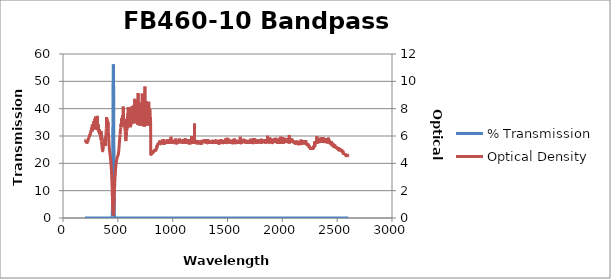
| Category | % Transmission |
|---|---|
| 2600.0 | 0.003 |
| 2599.0 | 0.003 |
| 2598.0 | 0.003 |
| 2597.0 | 0.003 |
| 2596.0 | 0.003 |
| 2595.0 | 0.003 |
| 2594.0 | 0.002 |
| 2593.0 | 0.003 |
| 2592.0 | 0.003 |
| 2591.0 | 0.003 |
| 2590.0 | 0.002 |
| 2589.0 | 0.003 |
| 2588.0 | 0.003 |
| 2587.0 | 0.003 |
| 2586.0 | 0.002 |
| 2585.0 | 0.003 |
| 2584.0 | 0.002 |
| 2583.0 | 0.002 |
| 2582.0 | 0.003 |
| 2581.0 | 0.003 |
| 2580.0 | 0.003 |
| 2579.0 | 0.003 |
| 2578.0 | 0.003 |
| 2577.0 | 0.002 |
| 2576.0 | 0.002 |
| 2575.0 | 0.002 |
| 2574.0 | 0.002 |
| 2573.0 | 0.002 |
| 2572.0 | 0.002 |
| 2571.0 | 0.002 |
| 2570.0 | 0.002 |
| 2569.0 | 0.002 |
| 2568.0 | 0.002 |
| 2567.0 | 0.002 |
| 2566.0 | 0.002 |
| 2565.0 | 0.002 |
| 2564.0 | 0.002 |
| 2563.0 | 0.002 |
| 2562.0 | 0.002 |
| 2561.0 | 0.002 |
| 2560.0 | 0.002 |
| 2559.0 | 0.002 |
| 2558.0 | 0.002 |
| 2557.0 | 0.002 |
| 2556.0 | 0.002 |
| 2555.0 | 0.002 |
| 2554.0 | 0.002 |
| 2553.0 | 0.001 |
| 2552.0 | 0.001 |
| 2551.0 | 0.002 |
| 2550.0 | 0.001 |
| 2549.0 | 0.002 |
| 2548.0 | 0.001 |
| 2547.0 | 0.001 |
| 2546.0 | 0.001 |
| 2545.0 | 0.001 |
| 2544.0 | 0.001 |
| 2543.0 | 0.001 |
| 2542.0 | 0.001 |
| 2541.0 | 0.001 |
| 2540.0 | 0.001 |
| 2539.0 | 0.001 |
| 2538.0 | 0.001 |
| 2537.0 | 0.001 |
| 2536.0 | 0.001 |
| 2535.0 | 0.001 |
| 2534.0 | 0.001 |
| 2533.0 | 0.001 |
| 2532.0 | 0.001 |
| 2531.0 | 0.001 |
| 2530.0 | 0.001 |
| 2529.0 | 0.001 |
| 2528.0 | 0.001 |
| 2527.0 | 0.001 |
| 2526.0 | 0.001 |
| 2525.0 | 0.001 |
| 2524.0 | 0.001 |
| 2523.0 | 0.001 |
| 2522.0 | 0.001 |
| 2521.0 | 0.001 |
| 2520.0 | 0.001 |
| 2519.0 | 0.001 |
| 2518.0 | 0.001 |
| 2517.0 | 0.001 |
| 2516.0 | 0.001 |
| 2515.0 | 0.001 |
| 2514.0 | 0.001 |
| 2513.0 | 0.001 |
| 2512.0 | 0.001 |
| 2511.0 | 0.001 |
| 2510.0 | 0.001 |
| 2509.0 | 0.001 |
| 2508.0 | 0.001 |
| 2507.0 | 0.001 |
| 2506.0 | 0.001 |
| 2505.0 | 0.001 |
| 2504.0 | 0.001 |
| 2503.0 | 0.001 |
| 2502.0 | 0.001 |
| 2501.0 | 0.001 |
| 2500.0 | 0.001 |
| 2499.0 | 0.001 |
| 2498.0 | 0.001 |
| 2497.0 | 0.001 |
| 2496.0 | 0.001 |
| 2495.0 | 0.001 |
| 2494.0 | 0.001 |
| 2493.0 | 0.001 |
| 2492.0 | 0.001 |
| 2491.0 | 0.001 |
| 2490.0 | 0.001 |
| 2489.0 | 0.001 |
| 2488.0 | 0.001 |
| 2487.0 | 0.001 |
| 2486.0 | 0.001 |
| 2485.0 | 0.001 |
| 2484.0 | 0.001 |
| 2483.0 | 0.001 |
| 2482.0 | 0.001 |
| 2481.0 | 0.001 |
| 2480.0 | 0 |
| 2479.0 | 0 |
| 2478.0 | 0.001 |
| 2477.0 | 0.001 |
| 2476.0 | 0.001 |
| 2475.0 | 0.001 |
| 2474.0 | 0 |
| 2473.0 | 0 |
| 2472.0 | 0.001 |
| 2471.0 | 0.001 |
| 2470.0 | 0.001 |
| 2469.0 | 0 |
| 2468.0 | 0 |
| 2467.0 | 0 |
| 2466.0 | 0 |
| 2465.0 | 0 |
| 2464.0 | 0 |
| 2463.0 | 0 |
| 2462.0 | 0 |
| 2461.0 | 0 |
| 2460.0 | 0 |
| 2459.0 | 0 |
| 2458.0 | 0 |
| 2457.0 | 0 |
| 2456.0 | 0 |
| 2455.0 | 0 |
| 2454.0 | 0.001 |
| 2453.0 | 0 |
| 2452.0 | 0 |
| 2451.0 | 0 |
| 2450.0 | 0 |
| 2449.0 | 0 |
| 2448.0 | 0 |
| 2447.0 | 0 |
| 2446.0 | 0 |
| 2445.0 | 0 |
| 2444.0 | 0 |
| 2443.0 | 0 |
| 2442.0 | 0 |
| 2441.0 | 0 |
| 2440.0 | 0 |
| 2439.0 | 0 |
| 2438.0 | 0 |
| 2437.0 | 0 |
| 2436.0 | 0 |
| 2435.0 | 0 |
| 2434.0 | 0 |
| 2433.0 | 0 |
| 2432.0 | 0 |
| 2431.0 | 0 |
| 2430.0 | 0 |
| 2429.0 | 0 |
| 2428.0 | 0 |
| 2427.0 | 0 |
| 2426.0 | 0 |
| 2425.0 | 0 |
| 2424.0 | 0 |
| 2423.0 | 0 |
| 2422.0 | 0 |
| 2421.0 | 0 |
| 2420.0 | 0 |
| 2419.0 | 0 |
| 2418.0 | 0 |
| 2417.0 | 0 |
| 2416.0 | 0 |
| 2415.0 | 0 |
| 2414.0 | 0 |
| 2413.0 | 0 |
| 2412.0 | 0 |
| 2411.0 | 0 |
| 2410.0 | 0 |
| 2409.0 | 0 |
| 2408.0 | 0 |
| 2407.0 | 0 |
| 2406.0 | 0 |
| 2405.0 | 0 |
| 2404.0 | 0 |
| 2403.0 | 0 |
| 2402.0 | 0 |
| 2401.0 | 0 |
| 2400.0 | 0 |
| 2399.0 | 0 |
| 2398.0 | 0 |
| 2397.0 | 0 |
| 2396.0 | 0 |
| 2395.0 | 0 |
| 2394.0 | 0 |
| 2393.0 | 0 |
| 2392.0 | 0 |
| 2391.0 | 0 |
| 2390.0 | 0 |
| 2389.0 | 0 |
| 2388.0 | 0 |
| 2387.0 | 0 |
| 2386.0 | 0 |
| 2385.0 | 0 |
| 2384.0 | 0 |
| 2383.0 | 0 |
| 2382.0 | 0 |
| 2381.0 | 0 |
| 2380.0 | 0 |
| 2379.0 | 0 |
| 2378.0 | 0 |
| 2377.0 | 0 |
| 2376.0 | 0 |
| 2375.0 | 0 |
| 2374.0 | 0 |
| 2373.0 | 0 |
| 2372.0 | 0 |
| 2371.0 | 0 |
| 2370.0 | 0 |
| 2369.0 | 0 |
| 2368.0 | 0 |
| 2367.0 | 0 |
| 2366.0 | 0 |
| 2365.0 | 0 |
| 2364.0 | 0 |
| 2363.0 | 0 |
| 2362.0 | 0 |
| 2361.0 | 0 |
| 2360.0 | 0 |
| 2359.0 | 0 |
| 2358.0 | 0 |
| 2357.0 | 0 |
| 2356.0 | 0 |
| 2355.0 | 0 |
| 2354.0 | 0 |
| 2353.0 | 0 |
| 2352.0 | 0 |
| 2351.0 | 0 |
| 2350.0 | 0 |
| 2349.0 | 0 |
| 2348.0 | 0 |
| 2347.0 | 0 |
| 2346.0 | 0 |
| 2345.0 | 0 |
| 2344.0 | 0 |
| 2343.0 | 0 |
| 2342.0 | 0 |
| 2341.0 | 0 |
| 2340.0 | 0 |
| 2339.0 | 0 |
| 2338.0 | 0 |
| 2337.0 | 0 |
| 2336.0 | 0 |
| 2335.0 | 0 |
| 2334.0 | 0 |
| 2333.0 | 0 |
| 2332.0 | 0 |
| 2331.0 | 0 |
| 2330.0 | 0 |
| 2329.0 | 0 |
| 2328.0 | 0 |
| 2327.0 | 0 |
| 2326.0 | 0 |
| 2325.0 | 0 |
| 2324.0 | 0 |
| 2323.0 | 0 |
| 2322.0 | 0 |
| 2321.0 | 0 |
| 2320.0 | 0 |
| 2319.0 | 0 |
| 2318.0 | 0 |
| 2317.0 | 0 |
| 2316.0 | 0 |
| 2315.0 | 0 |
| 2314.0 | 0 |
| 2313.0 | 0 |
| 2312.0 | 0 |
| 2311.0 | 0 |
| 2310.0 | 0 |
| 2309.0 | 0 |
| 2308.0 | 0 |
| 2307.0 | 0 |
| 2306.0 | 0 |
| 2305.0 | 0 |
| 2304.0 | 0 |
| 2303.0 | 0 |
| 2302.0 | 0 |
| 2301.0 | 0 |
| 2300.0 | 0 |
| 2299.0 | 0 |
| 2298.0 | 0 |
| 2297.0 | 0 |
| 2296.0 | 0 |
| 2295.0 | 0.001 |
| 2294.0 | 0 |
| 2293.0 | 0 |
| 2292.0 | 0.001 |
| 2291.0 | 0.001 |
| 2290.0 | 0.001 |
| 2289.0 | 0.001 |
| 2288.0 | 0.001 |
| 2287.0 | 0.001 |
| 2286.0 | 0.001 |
| 2285.0 | 0.001 |
| 2284.0 | 0.001 |
| 2283.0 | 0.001 |
| 2282.0 | 0.001 |
| 2281.0 | 0.001 |
| 2280.0 | 0.001 |
| 2279.0 | 0.001 |
| 2278.0 | 0.001 |
| 2277.0 | 0.001 |
| 2276.0 | 0.001 |
| 2275.0 | 0.001 |
| 2274.0 | 0.001 |
| 2273.0 | 0.001 |
| 2272.0 | 0.001 |
| 2271.0 | 0.001 |
| 2270.0 | 0.001 |
| 2269.0 | 0.001 |
| 2268.0 | 0.001 |
| 2267.0 | 0.001 |
| 2266.0 | 0.001 |
| 2265.0 | 0.001 |
| 2264.0 | 0.001 |
| 2263.0 | 0.001 |
| 2262.0 | 0.001 |
| 2261.0 | 0.001 |
| 2260.0 | 0.001 |
| 2259.0 | 0.001 |
| 2258.0 | 0.001 |
| 2257.0 | 0.001 |
| 2256.0 | 0.001 |
| 2255.0 | 0.001 |
| 2254.0 | 0.001 |
| 2253.0 | 0.001 |
| 2252.0 | 0.001 |
| 2251.0 | 0.001 |
| 2250.0 | 0.001 |
| 2249.0 | 0.001 |
| 2248.0 | 0.001 |
| 2247.0 | 0.001 |
| 2246.0 | 0.001 |
| 2245.0 | 0.001 |
| 2244.0 | 0.001 |
| 2243.0 | 0.001 |
| 2242.0 | 0.001 |
| 2241.0 | 0.001 |
| 2240.0 | 0 |
| 2239.0 | 0 |
| 2238.0 | 0 |
| 2237.0 | 0 |
| 2236.0 | 0 |
| 2235.0 | 0 |
| 2234.0 | 0 |
| 2233.0 | 0.001 |
| 2232.0 | 0 |
| 2231.0 | 0 |
| 2230.0 | 0 |
| 2229.0 | 0 |
| 2228.0 | 0 |
| 2227.0 | 0 |
| 2226.0 | 0 |
| 2225.0 | 0 |
| 2224.0 | 0 |
| 2223.0 | 0 |
| 2222.0 | 0 |
| 2221.0 | 0 |
| 2220.0 | 0 |
| 2219.0 | 0 |
| 2218.0 | 0 |
| 2217.0 | 0 |
| 2216.0 | 0 |
| 2215.0 | 0 |
| 2214.0 | 0 |
| 2213.0 | 0 |
| 2212.0 | 0 |
| 2211.0 | 0 |
| 2210.0 | 0 |
| 2209.0 | 0 |
| 2208.0 | 0 |
| 2207.0 | 0 |
| 2206.0 | 0 |
| 2205.0 | 0 |
| 2204.0 | 0 |
| 2203.0 | 0 |
| 2202.0 | 0 |
| 2201.0 | 0 |
| 2200.0 | 0 |
| 2199.0 | 0 |
| 2198.0 | 0 |
| 2197.0 | 0 |
| 2196.0 | 0 |
| 2195.0 | 0 |
| 2194.0 | 0 |
| 2193.0 | 0 |
| 2192.0 | 0 |
| 2191.0 | 0 |
| 2190.0 | 0 |
| 2189.0 | 0 |
| 2188.0 | 0 |
| 2187.0 | 0 |
| 2186.0 | 0 |
| 2185.0 | 0 |
| 2184.0 | 0 |
| 2183.0 | 0 |
| 2182.0 | 0 |
| 2181.0 | 0 |
| 2180.0 | 0 |
| 2179.0 | 0 |
| 2178.0 | 0 |
| 2177.0 | 0 |
| 2176.0 | 0 |
| 2175.0 | 0 |
| 2174.0 | 0 |
| 2173.0 | 0 |
| 2172.0 | 0 |
| 2171.0 | 0 |
| 2170.0 | 0 |
| 2169.0 | 0 |
| 2168.0 | 0 |
| 2167.0 | 0 |
| 2166.0 | 0 |
| 2165.0 | 0 |
| 2164.0 | 0 |
| 2163.0 | 0 |
| 2162.0 | 0 |
| 2161.0 | 0 |
| 2160.0 | 0 |
| 2159.0 | 0 |
| 2158.0 | 0 |
| 2157.0 | 0 |
| 2156.0 | 0 |
| 2155.0 | 0 |
| 2154.0 | 0 |
| 2153.0 | 0 |
| 2152.0 | 0 |
| 2151.0 | 0 |
| 2150.0 | 0 |
| 2149.0 | 0 |
| 2148.0 | 0 |
| 2147.0 | 0 |
| 2146.0 | 0 |
| 2145.0 | 0 |
| 2144.0 | 0 |
| 2143.0 | 0 |
| 2142.0 | 0 |
| 2141.0 | 0 |
| 2140.0 | 0 |
| 2139.0 | 0 |
| 2138.0 | 0 |
| 2137.0 | 0 |
| 2136.0 | 0 |
| 2135.0 | 0 |
| 2134.0 | 0 |
| 2133.0 | 0 |
| 2132.0 | 0 |
| 2131.0 | 0 |
| 2130.0 | 0 |
| 2129.0 | 0 |
| 2128.0 | 0 |
| 2127.0 | 0 |
| 2126.0 | 0 |
| 2125.0 | 0 |
| 2124.0 | 0 |
| 2123.0 | 0 |
| 2122.0 | 0 |
| 2121.0 | 0 |
| 2120.0 | 0 |
| 2119.0 | 0 |
| 2118.0 | 0 |
| 2117.0 | 0 |
| 2116.0 | 0 |
| 2115.0 | 0 |
| 2114.0 | 0 |
| 2113.0 | 0 |
| 2112.0 | 0 |
| 2111.0 | 0 |
| 2110.0 | 0 |
| 2109.0 | 0 |
| 2108.0 | 0 |
| 2107.0 | 0 |
| 2106.0 | 0 |
| 2105.0 | 0 |
| 2104.0 | 0 |
| 2103.0 | 0 |
| 2102.0 | 0 |
| 2101.0 | 0 |
| 2100.0 | 0 |
| 2099.0 | 0 |
| 2098.0 | 0 |
| 2097.0 | 0 |
| 2096.0 | 0 |
| 2095.0 | 0 |
| 2094.0 | 0 |
| 2093.0 | 0 |
| 2092.0 | 0 |
| 2091.0 | 0 |
| 2090.0 | 0 |
| 2089.0 | 0 |
| 2088.0 | 0 |
| 2087.0 | 0 |
| 2086.0 | 0 |
| 2085.0 | 0 |
| 2084.0 | 0 |
| 2083.0 | 0 |
| 2082.0 | 0 |
| 2081.0 | 0 |
| 2080.0 | 0 |
| 2079.0 | 0 |
| 2078.0 | 0 |
| 2077.0 | 0 |
| 2076.0 | 0 |
| 2075.0 | 0 |
| 2074.0 | 0 |
| 2073.0 | 0 |
| 2072.0 | 0 |
| 2071.0 | 0 |
| 2070.0 | 0 |
| 2069.0 | 0 |
| 2068.0 | 0 |
| 2067.0 | 0 |
| 2066.0 | 0 |
| 2065.0 | 0 |
| 2064.0 | 0 |
| 2063.0 | 0 |
| 2062.0 | 0 |
| 2061.0 | 0 |
| 2060.0 | 0 |
| 2059.0 | 0 |
| 2058.0 | 0 |
| 2057.0 | 0 |
| 2056.0 | 0 |
| 2055.0 | 0 |
| 2054.0 | 0 |
| 2053.0 | 0 |
| 2052.0 | 0 |
| 2051.0 | 0 |
| 2050.0 | 0 |
| 2049.0 | 0 |
| 2048.0 | 0 |
| 2047.0 | 0 |
| 2046.0 | 0 |
| 2045.0 | 0 |
| 2044.0 | 0 |
| 2043.0 | 0 |
| 2042.0 | 0 |
| 2041.0 | 0 |
| 2040.0 | 0 |
| 2039.0 | 0 |
| 2038.0 | 0 |
| 2037.0 | 0 |
| 2036.0 | 0 |
| 2035.0 | 0 |
| 2034.0 | 0 |
| 2033.0 | 0 |
| 2032.0 | 0 |
| 2031.0 | 0 |
| 2030.0 | 0 |
| 2029.0 | 0 |
| 2028.0 | 0 |
| 2027.0 | 0 |
| 2026.0 | 0 |
| 2025.0 | 0 |
| 2024.0 | 0 |
| 2023.0 | 0 |
| 2022.0 | 0 |
| 2021.0 | 0 |
| 2020.0 | 0 |
| 2019.0 | 0 |
| 2018.0 | 0 |
| 2017.0 | 0 |
| 2016.0 | 0 |
| 2015.0 | 0 |
| 2014.0 | 0 |
| 2013.0 | 0 |
| 2012.0 | 0 |
| 2011.0 | 0 |
| 2010.0 | 0 |
| 2009.0 | 0 |
| 2008.0 | 0 |
| 2007.0 | 0 |
| 2006.0 | 0 |
| 2005.0 | 0 |
| 2004.0 | 0 |
| 2003.0 | 0 |
| 2002.0 | 0 |
| 2001.0 | 0 |
| 2000.0 | 0 |
| 1999.0 | 0 |
| 1998.0 | 0 |
| 1997.0 | 0 |
| 1996.0 | 0 |
| 1995.0 | 0 |
| 1994.0 | 0 |
| 1993.0 | 0 |
| 1992.0 | 0 |
| 1991.0 | 0 |
| 1990.0 | 0 |
| 1989.0 | 0 |
| 1988.0 | 0 |
| 1987.0 | 0 |
| 1986.0 | 0 |
| 1985.0 | 0 |
| 1984.0 | 0 |
| 1983.0 | 0 |
| 1982.0 | 0 |
| 1981.0 | 0 |
| 1980.0 | 0 |
| 1979.0 | 0 |
| 1978.0 | 0 |
| 1977.0 | 0 |
| 1976.0 | 0 |
| 1975.0 | 0 |
| 1974.0 | 0 |
| 1973.0 | 0 |
| 1972.0 | 0 |
| 1971.0 | 0 |
| 1970.0 | 0 |
| 1969.0 | 0 |
| 1968.0 | 0 |
| 1967.0 | 0 |
| 1966.0 | 0 |
| 1965.0 | 0 |
| 1964.0 | 0 |
| 1963.0 | 0 |
| 1962.0 | 0 |
| 1961.0 | 0 |
| 1960.0 | 0 |
| 1959.0 | 0 |
| 1958.0 | 0 |
| 1957.0 | 0 |
| 1956.0 | 0 |
| 1955.0 | 0 |
| 1954.0 | 0 |
| 1953.0 | 0 |
| 1952.0 | 0 |
| 1951.0 | 0 |
| 1950.0 | 0 |
| 1949.0 | 0 |
| 1948.0 | 0 |
| 1947.0 | 0 |
| 1946.0 | 0 |
| 1945.0 | 0 |
| 1944.0 | 0 |
| 1943.0 | 0 |
| 1942.0 | 0 |
| 1941.0 | 0 |
| 1940.0 | 0 |
| 1939.0 | 0 |
| 1938.0 | 0 |
| 1937.0 | 0 |
| 1936.0 | 0 |
| 1935.0 | 0 |
| 1934.0 | 0 |
| 1933.0 | 0 |
| 1932.0 | 0 |
| 1931.0 | 0 |
| 1930.0 | 0 |
| 1929.0 | 0 |
| 1928.0 | 0 |
| 1927.0 | 0 |
| 1926.0 | 0 |
| 1925.0 | 0 |
| 1924.0 | 0 |
| 1923.0 | 0 |
| 1922.0 | 0 |
| 1921.0 | 0 |
| 1920.0 | 0 |
| 1919.0 | 0 |
| 1918.0 | 0 |
| 1917.0 | 0 |
| 1916.0 | 0 |
| 1915.0 | 0 |
| 1914.0 | 0 |
| 1913.0 | 0 |
| 1912.0 | 0 |
| 1911.0 | 0 |
| 1910.0 | 0 |
| 1909.0 | 0 |
| 1908.0 | 0 |
| 1907.0 | 0 |
| 1906.0 | 0 |
| 1905.0 | 0 |
| 1904.0 | 0 |
| 1903.0 | 0 |
| 1902.0 | 0 |
| 1901.0 | 0 |
| 1900.0 | 0 |
| 1899.0 | 0 |
| 1898.0 | 0 |
| 1897.0 | 0 |
| 1896.0 | 0 |
| 1895.0 | 0 |
| 1894.0 | 0 |
| 1893.0 | 0 |
| 1892.0 | 0 |
| 1891.0 | 0 |
| 1890.0 | 0 |
| 1889.0 | 0 |
| 1888.0 | 0 |
| 1887.0 | 0 |
| 1886.0 | 0 |
| 1885.0 | 0 |
| 1884.0 | 0 |
| 1883.0 | 0 |
| 1882.0 | 0 |
| 1881.0 | 0 |
| 1880.0 | 0 |
| 1879.0 | 0 |
| 1878.0 | 0 |
| 1877.0 | 0 |
| 1876.0 | 0 |
| 1875.0 | 0 |
| 1874.0 | 0 |
| 1873.0 | 0 |
| 1872.0 | 0 |
| 1871.0 | 0 |
| 1870.0 | 0 |
| 1869.0 | 0 |
| 1868.0 | 0 |
| 1867.0 | 0 |
| 1866.0 | 0 |
| 1865.0 | 0 |
| 1864.0 | 0 |
| 1863.0 | 0 |
| 1862.0 | 0 |
| 1861.0 | 0 |
| 1860.0 | 0 |
| 1859.0 | 0 |
| 1858.0 | 0 |
| 1857.0 | 0 |
| 1856.0 | 0 |
| 1855.0 | 0 |
| 1854.0 | 0 |
| 1853.0 | 0 |
| 1852.0 | 0 |
| 1851.0 | 0 |
| 1850.0 | 0 |
| 1849.0 | 0 |
| 1848.0 | 0 |
| 1847.0 | 0 |
| 1846.0 | 0 |
| 1845.0 | 0 |
| 1844.0 | 0 |
| 1843.0 | 0 |
| 1842.0 | 0 |
| 1841.0 | 0 |
| 1840.0 | 0 |
| 1839.0 | 0 |
| 1838.0 | 0 |
| 1837.0 | 0 |
| 1836.0 | 0 |
| 1835.0 | 0 |
| 1834.0 | 0 |
| 1833.0 | 0 |
| 1832.0 | 0 |
| 1831.0 | 0 |
| 1830.0 | 0 |
| 1829.0 | 0 |
| 1828.0 | 0 |
| 1827.0 | 0 |
| 1826.0 | 0 |
| 1825.0 | 0 |
| 1824.0 | 0 |
| 1823.0 | 0 |
| 1822.0 | 0 |
| 1821.0 | 0 |
| 1820.0 | 0 |
| 1819.0 | 0 |
| 1818.0 | 0 |
| 1817.0 | 0 |
| 1816.0 | 0 |
| 1815.0 | 0 |
| 1814.0 | 0 |
| 1813.0 | 0 |
| 1812.0 | 0 |
| 1811.0 | 0 |
| 1810.0 | 0 |
| 1809.0 | 0 |
| 1808.0 | 0 |
| 1807.0 | 0 |
| 1806.0 | 0 |
| 1805.0 | 0 |
| 1804.0 | 0 |
| 1803.0 | 0 |
| 1802.0 | 0 |
| 1801.0 | 0 |
| 1800.0 | 0 |
| 1799.0 | 0 |
| 1798.0 | 0 |
| 1797.0 | 0 |
| 1796.0 | 0 |
| 1795.0 | 0 |
| 1794.0 | 0 |
| 1793.0 | 0 |
| 1792.0 | 0 |
| 1791.0 | 0 |
| 1790.0 | 0 |
| 1789.0 | 0 |
| 1788.0 | 0 |
| 1787.0 | 0 |
| 1786.0 | 0 |
| 1785.0 | 0 |
| 1784.0 | 0 |
| 1783.0 | 0 |
| 1782.0 | 0 |
| 1781.0 | 0 |
| 1780.0 | 0 |
| 1779.0 | 0 |
| 1778.0 | 0 |
| 1777.0 | 0 |
| 1776.0 | 0 |
| 1775.0 | 0 |
| 1774.0 | 0 |
| 1773.0 | 0 |
| 1772.0 | 0 |
| 1771.0 | 0 |
| 1770.0 | 0 |
| 1769.0 | 0 |
| 1768.0 | 0 |
| 1767.0 | 0 |
| 1766.0 | 0 |
| 1765.0 | 0 |
| 1764.0 | 0 |
| 1763.0 | 0 |
| 1762.0 | 0 |
| 1761.0 | 0 |
| 1760.0 | 0 |
| 1759.0 | 0 |
| 1758.0 | 0 |
| 1757.0 | 0 |
| 1756.0 | 0 |
| 1755.0 | 0 |
| 1754.0 | 0 |
| 1753.0 | 0 |
| 1752.0 | 0 |
| 1751.0 | 0 |
| 1750.0 | 0 |
| 1749.0 | 0 |
| 1748.0 | 0 |
| 1747.0 | 0 |
| 1746.0 | 0 |
| 1745.0 | 0 |
| 1744.0 | 0 |
| 1743.0 | 0 |
| 1742.0 | 0 |
| 1741.0 | 0 |
| 1740.0 | 0 |
| 1739.0 | 0 |
| 1738.0 | 0 |
| 1737.0 | 0 |
| 1736.0 | 0 |
| 1735.0 | 0 |
| 1734.0 | 0 |
| 1733.0 | 0 |
| 1732.0 | 0 |
| 1731.0 | 0 |
| 1730.0 | 0 |
| 1729.0 | 0 |
| 1728.0 | 0 |
| 1727.0 | 0 |
| 1726.0 | 0 |
| 1725.0 | 0 |
| 1724.0 | 0 |
| 1723.0 | 0 |
| 1722.0 | 0 |
| 1721.0 | 0 |
| 1720.0 | 0 |
| 1719.0 | 0 |
| 1718.0 | 0 |
| 1717.0 | 0 |
| 1716.0 | 0 |
| 1715.0 | 0 |
| 1714.0 | 0 |
| 1713.0 | 0 |
| 1712.0 | 0 |
| 1711.0 | 0 |
| 1710.0 | 0 |
| 1709.0 | 0 |
| 1708.0 | 0 |
| 1707.0 | 0 |
| 1706.0 | 0 |
| 1705.0 | 0 |
| 1704.0 | 0 |
| 1703.0 | 0 |
| 1702.0 | 0 |
| 1701.0 | 0 |
| 1700.0 | 0 |
| 1699.0 | 0 |
| 1698.0 | 0 |
| 1697.0 | 0 |
| 1696.0 | 0 |
| 1695.0 | 0 |
| 1694.0 | 0 |
| 1693.0 | 0 |
| 1692.0 | 0 |
| 1691.0 | 0 |
| 1690.0 | 0 |
| 1689.0 | 0 |
| 1688.0 | 0 |
| 1687.0 | 0 |
| 1686.0 | 0 |
| 1685.0 | 0 |
| 1684.0 | 0 |
| 1683.0 | 0 |
| 1682.0 | 0 |
| 1681.0 | 0 |
| 1680.0 | 0 |
| 1679.0 | 0 |
| 1678.0 | 0 |
| 1677.0 | 0 |
| 1676.0 | 0 |
| 1675.0 | 0 |
| 1674.0 | 0 |
| 1673.0 | 0 |
| 1672.0 | 0 |
| 1671.0 | 0 |
| 1670.0 | 0 |
| 1669.0 | 0 |
| 1668.0 | 0 |
| 1667.0 | 0 |
| 1666.0 | 0 |
| 1665.0 | 0 |
| 1664.0 | 0 |
| 1663.0 | 0 |
| 1662.0 | 0 |
| 1661.0 | 0 |
| 1660.0 | 0 |
| 1659.0 | 0 |
| 1658.0 | 0 |
| 1657.0 | 0 |
| 1656.0 | 0 |
| 1655.0 | 0 |
| 1654.0 | 0 |
| 1653.0 | 0 |
| 1652.0 | 0 |
| 1651.0 | 0 |
| 1650.0 | 0 |
| 1649.0 | 0 |
| 1648.0 | 0 |
| 1647.0 | 0 |
| 1646.0 | 0 |
| 1645.0 | 0 |
| 1644.0 | 0 |
| 1643.0 | 0 |
| 1642.0 | 0 |
| 1641.0 | 0 |
| 1640.0 | 0 |
| 1639.0 | 0 |
| 1638.0 | 0 |
| 1637.0 | 0 |
| 1636.0 | 0 |
| 1635.0 | 0 |
| 1634.0 | 0 |
| 1633.0 | 0 |
| 1632.0 | 0 |
| 1631.0 | 0 |
| 1630.0 | 0 |
| 1629.0 | 0 |
| 1628.0 | 0 |
| 1627.0 | 0 |
| 1626.0 | 0 |
| 1625.0 | 0 |
| 1624.0 | 0 |
| 1623.0 | 0 |
| 1622.0 | 0 |
| 1621.0 | 0 |
| 1620.0 | 0 |
| 1619.0 | 0 |
| 1618.0 | 0 |
| 1617.0 | 0 |
| 1616.0 | 0 |
| 1615.0 | 0 |
| 1614.0 | 0 |
| 1613.0 | 0 |
| 1612.0 | 0 |
| 1611.0 | 0 |
| 1610.0 | 0 |
| 1609.0 | 0 |
| 1608.0 | 0 |
| 1607.0 | 0 |
| 1606.0 | 0 |
| 1605.0 | 0 |
| 1604.0 | 0 |
| 1603.0 | 0 |
| 1602.0 | 0 |
| 1601.0 | 0 |
| 1600.0 | 0 |
| 1599.0 | 0 |
| 1598.0 | 0 |
| 1597.0 | 0 |
| 1596.0 | 0 |
| 1595.0 | 0 |
| 1594.0 | 0 |
| 1593.0 | 0 |
| 1592.0 | 0 |
| 1591.0 | 0 |
| 1590.0 | 0 |
| 1589.0 | 0 |
| 1588.0 | 0 |
| 1587.0 | 0 |
| 1586.0 | 0 |
| 1585.0 | 0 |
| 1584.0 | 0 |
| 1583.0 | 0 |
| 1582.0 | 0 |
| 1581.0 | 0 |
| 1580.0 | 0 |
| 1579.0 | 0 |
| 1578.0 | 0 |
| 1577.0 | 0 |
| 1576.0 | 0 |
| 1575.0 | 0 |
| 1574.0 | 0 |
| 1573.0 | 0 |
| 1572.0 | 0 |
| 1571.0 | 0 |
| 1570.0 | 0 |
| 1569.0 | 0 |
| 1568.0 | 0 |
| 1567.0 | 0 |
| 1566.0 | 0 |
| 1565.0 | 0 |
| 1564.0 | 0 |
| 1563.0 | 0 |
| 1562.0 | 0 |
| 1561.0 | 0 |
| 1560.0 | 0 |
| 1559.0 | 0 |
| 1558.0 | 0 |
| 1557.0 | 0 |
| 1556.0 | 0 |
| 1555.0 | 0 |
| 1554.0 | 0 |
| 1553.0 | 0 |
| 1552.0 | 0 |
| 1551.0 | 0 |
| 1550.0 | 0 |
| 1549.0 | 0 |
| 1548.0 | 0 |
| 1547.0 | 0 |
| 1546.0 | 0 |
| 1545.0 | 0 |
| 1544.0 | 0 |
| 1543.0 | 0 |
| 1542.0 | 0 |
| 1541.0 | 0 |
| 1540.0 | 0 |
| 1539.0 | 0 |
| 1538.0 | 0 |
| 1537.0 | 0 |
| 1536.0 | 0 |
| 1535.0 | 0 |
| 1534.0 | 0 |
| 1533.0 | 0 |
| 1532.0 | 0 |
| 1531.0 | 0 |
| 1530.0 | 0 |
| 1529.0 | 0 |
| 1528.0 | 0 |
| 1527.0 | 0 |
| 1526.0 | 0 |
| 1525.0 | 0 |
| 1524.0 | 0 |
| 1523.0 | 0 |
| 1522.0 | 0 |
| 1521.0 | 0 |
| 1520.0 | 0 |
| 1519.0 | 0 |
| 1518.0 | 0 |
| 1517.0 | 0 |
| 1516.0 | 0 |
| 1515.0 | 0 |
| 1514.0 | 0 |
| 1513.0 | 0 |
| 1512.0 | 0 |
| 1511.0 | 0 |
| 1510.0 | 0 |
| 1509.0 | 0 |
| 1508.0 | 0 |
| 1507.0 | 0 |
| 1506.0 | 0 |
| 1505.0 | 0 |
| 1504.0 | 0 |
| 1503.0 | 0 |
| 1502.0 | 0 |
| 1501.0 | 0 |
| 1500.0 | 0 |
| 1499.0 | 0 |
| 1498.0 | 0 |
| 1497.0 | 0 |
| 1496.0 | 0 |
| 1495.0 | 0 |
| 1494.0 | 0 |
| 1493.0 | 0 |
| 1492.0 | 0 |
| 1491.0 | 0 |
| 1490.0 | 0 |
| 1489.0 | 0 |
| 1488.0 | 0 |
| 1487.0 | 0 |
| 1486.0 | 0 |
| 1485.0 | 0 |
| 1484.0 | 0 |
| 1483.0 | 0 |
| 1482.0 | 0 |
| 1481.0 | 0 |
| 1480.0 | 0 |
| 1479.0 | 0 |
| 1478.0 | 0 |
| 1477.0 | 0 |
| 1476.0 | 0 |
| 1475.0 | 0 |
| 1474.0 | 0 |
| 1473.0 | 0 |
| 1472.0 | 0 |
| 1471.0 | 0 |
| 1470.0 | 0 |
| 1469.0 | 0 |
| 1468.0 | 0 |
| 1467.0 | 0 |
| 1466.0 | 0 |
| 1465.0 | 0 |
| 1464.0 | 0 |
| 1463.0 | 0 |
| 1462.0 | 0 |
| 1461.0 | 0 |
| 1460.0 | 0 |
| 1459.0 | 0 |
| 1458.0 | 0 |
| 1457.0 | 0 |
| 1456.0 | 0 |
| 1455.0 | 0 |
| 1454.0 | 0 |
| 1453.0 | 0 |
| 1452.0 | 0 |
| 1451.0 | 0 |
| 1450.0 | 0 |
| 1449.0 | 0 |
| 1448.0 | 0 |
| 1447.0 | 0 |
| 1446.0 | 0 |
| 1445.0 | 0 |
| 1444.0 | 0 |
| 1443.0 | 0 |
| 1442.0 | 0 |
| 1441.0 | 0 |
| 1440.0 | 0 |
| 1439.0 | 0 |
| 1438.0 | 0 |
| 1437.0 | 0 |
| 1436.0 | 0 |
| 1435.0 | 0 |
| 1434.0 | 0 |
| 1433.0 | 0 |
| 1432.0 | 0 |
| 1431.0 | 0 |
| 1430.0 | 0 |
| 1429.0 | 0 |
| 1428.0 | 0 |
| 1427.0 | 0 |
| 1426.0 | 0 |
| 1425.0 | 0 |
| 1424.0 | 0 |
| 1423.0 | 0 |
| 1422.0 | 0 |
| 1421.0 | 0 |
| 1420.0 | 0 |
| 1419.0 | 0 |
| 1418.0 | 0 |
| 1417.0 | 0 |
| 1416.0 | 0 |
| 1415.0 | 0 |
| 1414.0 | 0 |
| 1413.0 | 0 |
| 1412.0 | 0 |
| 1411.0 | 0 |
| 1410.0 | 0 |
| 1409.0 | 0 |
| 1408.0 | 0 |
| 1407.0 | 0 |
| 1406.0 | 0 |
| 1405.0 | 0 |
| 1404.0 | 0 |
| 1403.0 | 0 |
| 1402.0 | 0 |
| 1401.0 | 0 |
| 1400.0 | 0 |
| 1399.0 | 0 |
| 1398.0 | 0 |
| 1397.0 | 0 |
| 1396.0 | 0 |
| 1395.0 | 0 |
| 1394.0 | 0 |
| 1393.0 | 0 |
| 1392.0 | 0 |
| 1391.0 | 0 |
| 1390.0 | 0 |
| 1389.0 | 0 |
| 1388.0 | 0 |
| 1387.0 | 0 |
| 1386.0 | 0 |
| 1385.0 | 0 |
| 1384.0 | 0 |
| 1383.0 | 0 |
| 1382.0 | 0 |
| 1381.0 | 0 |
| 1380.0 | 0 |
| 1379.0 | 0 |
| 1378.0 | 0 |
| 1377.0 | 0 |
| 1376.0 | 0 |
| 1375.0 | 0 |
| 1374.0 | 0 |
| 1373.0 | 0 |
| 1372.0 | 0 |
| 1371.0 | 0 |
| 1370.0 | 0 |
| 1369.0 | 0 |
| 1368.0 | 0 |
| 1367.0 | 0 |
| 1366.0 | 0 |
| 1365.0 | 0 |
| 1364.0 | 0 |
| 1363.0 | 0 |
| 1362.0 | 0 |
| 1361.0 | 0 |
| 1360.0 | 0 |
| 1359.0 | 0 |
| 1358.0 | 0 |
| 1357.0 | 0 |
| 1356.0 | 0 |
| 1355.0 | 0 |
| 1354.0 | 0 |
| 1353.0 | 0 |
| 1352.0 | 0 |
| 1351.0 | 0 |
| 1350.0 | 0 |
| 1349.0 | 0 |
| 1348.0 | 0 |
| 1347.0 | 0 |
| 1346.0 | 0 |
| 1345.0 | 0 |
| 1344.0 | 0 |
| 1343.0 | 0 |
| 1342.0 | 0 |
| 1341.0 | 0 |
| 1340.0 | 0 |
| 1339.0 | 0 |
| 1338.0 | 0 |
| 1337.0 | 0 |
| 1336.0 | 0 |
| 1335.0 | 0 |
| 1334.0 | 0 |
| 1333.0 | 0 |
| 1332.0 | 0 |
| 1331.0 | 0 |
| 1330.0 | 0 |
| 1329.0 | 0 |
| 1328.0 | 0 |
| 1327.0 | 0 |
| 1326.0 | 0 |
| 1325.0 | 0 |
| 1324.0 | 0 |
| 1323.0 | 0 |
| 1322.0 | 0 |
| 1321.0 | 0 |
| 1320.0 | 0 |
| 1319.0 | 0 |
| 1318.0 | 0 |
| 1317.0 | 0 |
| 1316.0 | 0 |
| 1315.0 | 0 |
| 1314.0 | 0 |
| 1313.0 | 0 |
| 1312.0 | 0 |
| 1311.0 | 0 |
| 1310.0 | 0 |
| 1309.0 | 0 |
| 1308.0 | 0 |
| 1307.0 | 0 |
| 1306.0 | 0 |
| 1305.0 | 0 |
| 1304.0 | 0 |
| 1303.0 | 0 |
| 1302.0 | 0 |
| 1301.0 | 0 |
| 1300.0 | 0 |
| 1299.0 | 0 |
| 1298.0 | 0 |
| 1297.0 | 0 |
| 1296.0 | 0 |
| 1295.0 | 0 |
| 1294.0 | 0 |
| 1293.0 | 0 |
| 1292.0 | 0 |
| 1291.0 | 0 |
| 1290.0 | 0 |
| 1289.0 | 0 |
| 1288.0 | 0 |
| 1287.0 | 0 |
| 1286.0 | 0 |
| 1285.0 | 0 |
| 1284.0 | 0 |
| 1283.0 | 0 |
| 1282.0 | 0 |
| 1281.0 | 0 |
| 1280.0 | 0 |
| 1279.0 | 0 |
| 1278.0 | 0 |
| 1277.0 | 0 |
| 1276.0 | 0 |
| 1275.0 | 0 |
| 1274.0 | 0 |
| 1273.0 | 0 |
| 1272.0 | 0 |
| 1271.0 | 0 |
| 1270.0 | 0 |
| 1269.0 | 0 |
| 1268.0 | 0 |
| 1267.0 | 0 |
| 1266.0 | 0 |
| 1265.0 | 0 |
| 1264.0 | 0 |
| 1263.0 | 0 |
| 1262.0 | 0 |
| 1261.0 | 0 |
| 1260.0 | 0 |
| 1259.0 | 0 |
| 1258.0 | 0 |
| 1257.0 | 0 |
| 1256.0 | 0 |
| 1255.0 | 0 |
| 1254.0 | 0 |
| 1253.0 | 0 |
| 1252.0 | 0 |
| 1251.0 | 0 |
| 1250.0 | 0 |
| 1249.0 | 0 |
| 1248.0 | 0 |
| 1247.0 | 0 |
| 1246.0 | 0 |
| 1245.0 | 0 |
| 1244.0 | 0 |
| 1243.0 | 0 |
| 1242.0 | 0 |
| 1241.0 | 0 |
| 1240.0 | 0 |
| 1239.0 | 0 |
| 1238.0 | 0 |
| 1237.0 | 0 |
| 1236.0 | 0 |
| 1235.0 | 0 |
| 1234.0 | 0 |
| 1233.0 | 0 |
| 1232.0 | 0 |
| 1231.0 | 0 |
| 1230.0 | 0 |
| 1229.0 | 0 |
| 1228.0 | 0 |
| 1227.0 | 0 |
| 1226.0 | 0 |
| 1225.0 | 0 |
| 1224.0 | 0 |
| 1223.0 | 0 |
| 1222.0 | 0 |
| 1221.0 | 0 |
| 1220.0 | 0 |
| 1219.0 | 0 |
| 1218.0 | 0 |
| 1217.0 | 0 |
| 1216.0 | 0 |
| 1215.0 | 0 |
| 1214.0 | 0 |
| 1213.0 | 0 |
| 1212.0 | 0 |
| 1211.0 | 0 |
| 1210.0 | 0 |
| 1209.0 | 0 |
| 1208.0 | 0 |
| 1207.0 | 0 |
| 1206.0 | 0 |
| 1205.0 | 0 |
| 1204.0 | 0 |
| 1203.0 | 0 |
| 1202.0 | 0 |
| 1201.0 | 0 |
| 1200.0 | 0 |
| 1199.0 | 0 |
| 1198.0 | 0 |
| 1197.0 | 0 |
| 1196.0 | 0 |
| 1195.0 | 0 |
| 1194.0 | 0 |
| 1193.0 | 0 |
| 1192.0 | 0 |
| 1191.0 | 0 |
| 1190.0 | 0 |
| 1189.0 | 0 |
| 1188.0 | 0 |
| 1187.0 | 0 |
| 1186.0 | 0 |
| 1185.0 | 0 |
| 1184.0 | 0 |
| 1183.0 | 0 |
| 1182.0 | 0 |
| 1181.0 | 0 |
| 1180.0 | 0 |
| 1179.0 | 0 |
| 1178.0 | 0 |
| 1177.0 | 0 |
| 1176.0 | 0 |
| 1175.0 | 0 |
| 1174.0 | 0 |
| 1173.0 | 0 |
| 1172.0 | 0 |
| 1171.0 | 0 |
| 1170.0 | 0 |
| 1169.0 | 0 |
| 1168.0 | 0 |
| 1167.0 | 0 |
| 1166.0 | 0 |
| 1165.0 | 0 |
| 1164.0 | 0 |
| 1163.0 | 0 |
| 1162.0 | 0 |
| 1161.0 | 0 |
| 1160.0 | 0 |
| 1159.0 | 0 |
| 1158.0 | 0 |
| 1157.0 | 0 |
| 1156.0 | 0 |
| 1155.0 | 0 |
| 1154.0 | 0 |
| 1153.0 | 0 |
| 1152.0 | 0 |
| 1151.0 | 0 |
| 1150.0 | 0 |
| 1149.0 | 0 |
| 1148.0 | 0 |
| 1147.0 | 0 |
| 1146.0 | 0 |
| 1145.0 | 0 |
| 1144.0 | 0 |
| 1143.0 | 0 |
| 1142.0 | 0 |
| 1141.0 | 0 |
| 1140.0 | 0 |
| 1139.0 | 0 |
| 1138.0 | 0 |
| 1137.0 | 0 |
| 1136.0 | 0 |
| 1135.0 | 0 |
| 1134.0 | 0 |
| 1133.0 | 0 |
| 1132.0 | 0 |
| 1131.0 | 0 |
| 1130.0 | 0 |
| 1129.0 | 0 |
| 1128.0 | 0 |
| 1127.0 | 0 |
| 1126.0 | 0 |
| 1125.0 | 0 |
| 1124.0 | 0 |
| 1123.0 | 0 |
| 1122.0 | 0 |
| 1121.0 | 0 |
| 1120.0 | 0 |
| 1119.0 | 0 |
| 1118.0 | 0 |
| 1117.0 | 0 |
| 1116.0 | 0 |
| 1115.0 | 0 |
| 1114.0 | 0 |
| 1113.0 | 0 |
| 1112.0 | 0 |
| 1111.0 | 0 |
| 1110.0 | 0 |
| 1109.0 | 0 |
| 1108.0 | 0 |
| 1107.0 | 0 |
| 1106.0 | 0 |
| 1105.0 | 0 |
| 1104.0 | 0 |
| 1103.0 | 0 |
| 1102.0 | 0 |
| 1101.0 | 0 |
| 1100.0 | 0 |
| 1099.0 | 0 |
| 1098.0 | 0 |
| 1097.0 | 0 |
| 1096.0 | 0 |
| 1095.0 | 0 |
| 1094.0 | 0 |
| 1093.0 | 0 |
| 1092.0 | 0 |
| 1091.0 | 0 |
| 1090.0 | 0 |
| 1089.0 | 0 |
| 1088.0 | 0 |
| 1087.0 | 0 |
| 1086.0 | 0 |
| 1085.0 | 0 |
| 1084.0 | 0 |
| 1083.0 | 0 |
| 1082.0 | 0 |
| 1081.0 | 0 |
| 1080.0 | 0 |
| 1079.0 | 0 |
| 1078.0 | 0 |
| 1077.0 | 0 |
| 1076.0 | 0 |
| 1075.0 | 0 |
| 1074.0 | 0 |
| 1073.0 | 0 |
| 1072.0 | 0 |
| 1071.0 | 0 |
| 1070.0 | 0 |
| 1069.0 | 0 |
| 1068.0 | 0 |
| 1067.0 | 0 |
| 1066.0 | 0 |
| 1065.0 | 0 |
| 1064.0 | 0 |
| 1063.0 | 0 |
| 1062.0 | 0 |
| 1061.0 | 0 |
| 1060.0 | 0 |
| 1059.0 | 0 |
| 1058.0 | 0 |
| 1057.0 | 0 |
| 1056.0 | 0 |
| 1055.0 | 0 |
| 1054.0 | 0 |
| 1053.0 | 0 |
| 1052.0 | 0 |
| 1051.0 | 0 |
| 1050.0 | 0 |
| 1049.0 | 0 |
| 1048.0 | 0 |
| 1047.0 | 0 |
| 1046.0 | 0 |
| 1045.0 | 0 |
| 1044.0 | 0 |
| 1043.0 | 0 |
| 1042.0 | 0 |
| 1041.0 | 0 |
| 1040.0 | 0 |
| 1039.0 | 0 |
| 1038.0 | 0 |
| 1037.0 | 0 |
| 1036.0 | 0 |
| 1035.0 | 0 |
| 1034.0 | 0 |
| 1033.0 | 0 |
| 1032.0 | 0 |
| 1031.0 | 0 |
| 1030.0 | 0 |
| 1029.0 | 0 |
| 1028.0 | 0 |
| 1027.0 | 0 |
| 1026.0 | 0 |
| 1025.0 | 0 |
| 1024.0 | 0 |
| 1023.0 | 0 |
| 1022.0 | 0 |
| 1021.0 | 0 |
| 1020.0 | 0 |
| 1019.0 | 0 |
| 1018.0 | 0 |
| 1017.0 | 0 |
| 1016.0 | 0 |
| 1015.0 | 0 |
| 1014.0 | 0 |
| 1013.0 | 0 |
| 1012.0 | 0 |
| 1011.0 | 0 |
| 1010.0 | 0 |
| 1009.0 | 0 |
| 1008.0 | 0 |
| 1007.0 | 0 |
| 1006.0 | 0 |
| 1005.0 | 0 |
| 1004.0 | 0 |
| 1003.0 | 0 |
| 1002.0 | 0 |
| 1001.0 | 0 |
| 1000.0 | 0 |
| 999.0 | 0 |
| 998.0 | 0 |
| 997.0 | 0 |
| 996.0 | 0 |
| 995.0 | 0 |
| 994.0 | 0 |
| 993.0 | 0 |
| 992.0 | 0 |
| 991.0 | 0 |
| 990.0 | 0 |
| 989.0 | 0 |
| 988.0 | 0 |
| 987.0 | 0 |
| 986.0 | 0 |
| 985.0 | 0 |
| 984.0 | 0 |
| 983.0 | 0 |
| 982.0 | 0 |
| 981.0 | 0 |
| 980.0 | 0 |
| 979.0 | 0 |
| 978.0 | 0 |
| 977.0 | 0 |
| 976.0 | 0 |
| 975.0 | 0 |
| 974.0 | 0 |
| 973.0 | 0 |
| 972.0 | 0 |
| 971.0 | 0 |
| 970.0 | 0 |
| 969.0 | 0 |
| 968.0 | 0 |
| 967.0 | 0 |
| 966.0 | 0 |
| 965.0 | 0 |
| 964.0 | 0 |
| 963.0 | 0 |
| 962.0 | 0 |
| 961.0 | 0 |
| 960.0 | 0 |
| 959.0 | 0 |
| 958.0 | 0 |
| 957.0 | 0 |
| 956.0 | 0 |
| 955.0 | 0 |
| 954.0 | 0 |
| 953.0 | 0 |
| 952.0 | 0 |
| 951.0 | 0 |
| 950.0 | 0 |
| 949.0 | 0 |
| 948.0 | 0 |
| 947.0 | 0 |
| 946.0 | 0 |
| 945.0 | 0 |
| 944.0 | 0 |
| 943.0 | 0 |
| 942.0 | 0 |
| 941.0 | 0 |
| 940.0 | 0 |
| 939.0 | 0 |
| 938.0 | 0 |
| 937.0 | 0 |
| 936.0 | 0 |
| 935.0 | 0 |
| 934.0 | 0 |
| 933.0 | 0 |
| 932.0 | 0 |
| 931.0 | 0 |
| 930.0 | 0 |
| 929.0 | 0 |
| 928.0 | 0 |
| 927.0 | 0 |
| 926.0 | 0 |
| 925.0 | 0 |
| 924.0 | 0 |
| 923.0 | 0 |
| 922.0 | 0 |
| 921.0 | 0 |
| 920.0 | 0 |
| 919.0 | 0 |
| 918.0 | 0 |
| 917.0 | 0 |
| 916.0 | 0 |
| 915.0 | 0 |
| 914.0 | 0 |
| 913.0 | 0 |
| 912.0 | 0 |
| 911.0 | 0 |
| 910.0 | 0 |
| 909.0 | 0 |
| 908.0 | 0 |
| 907.0 | 0 |
| 906.0 | 0 |
| 905.0 | 0 |
| 904.0 | 0 |
| 903.0 | 0 |
| 902.0 | 0 |
| 901.0 | 0 |
| 900.0 | 0 |
| 899.0 | 0 |
| 898.0 | 0 |
| 897.0 | 0 |
| 896.0 | 0 |
| 895.0 | 0 |
| 894.0 | 0 |
| 893.0 | 0 |
| 892.0 | 0 |
| 891.0 | 0 |
| 890.0 | 0 |
| 889.0 | 0 |
| 888.0 | 0 |
| 887.0 | 0 |
| 886.0 | 0 |
| 885.0 | 0 |
| 884.0 | 0 |
| 883.0 | 0 |
| 882.0 | 0 |
| 881.0 | 0 |
| 880.0 | 0 |
| 879.0 | 0 |
| 878.0 | 0 |
| 877.0 | 0 |
| 876.0 | 0 |
| 875.0 | 0 |
| 874.0 | 0 |
| 873.0 | 0 |
| 872.0 | 0 |
| 871.0 | 0 |
| 870.0 | 0 |
| 869.0 | 0 |
| 868.0 | 0 |
| 867.0 | 0 |
| 866.0 | 0 |
| 865.0 | 0 |
| 864.0 | 0 |
| 863.0 | 0 |
| 862.0 | 0.001 |
| 861.0 | 0.001 |
| 860.0 | 0.001 |
| 859.0 | 0.001 |
| 858.0 | 0.001 |
| 857.0 | 0.001 |
| 856.0 | 0 |
| 855.0 | 0.001 |
| 854.0 | 0.001 |
| 853.0 | 0.001 |
| 852.0 | 0.001 |
| 851.0 | 0.001 |
| 850.0 | 0.001 |
| 849.0 | 0.001 |
| 848.0 | 0.001 |
| 847.0 | 0.001 |
| 846.0 | 0.001 |
| 845.0 | 0.001 |
| 844.0 | 0.001 |
| 843.0 | 0.001 |
| 842.0 | 0.001 |
| 841.0 | 0.001 |
| 840.0 | 0.001 |
| 839.0 | 0.001 |
| 838.0 | 0.001 |
| 837.0 | 0.001 |
| 836.0 | 0.001 |
| 835.0 | 0.001 |
| 834.0 | 0.001 |
| 833.0 | 0.001 |
| 832.0 | 0.001 |
| 831.0 | 0.001 |
| 830.0 | 0.001 |
| 829.0 | 0.001 |
| 828.0 | 0.001 |
| 827.0 | 0.001 |
| 826.0 | 0.001 |
| 825.0 | 0.001 |
| 824.0 | 0.001 |
| 823.0 | 0.002 |
| 822.0 | 0.001 |
| 821.0 | 0.001 |
| 820.0 | 0.001 |
| 819.0 | 0.001 |
| 818.0 | 0.002 |
| 817.0 | 0.002 |
| 816.0 | 0.002 |
| 815.0 | 0.002 |
| 814.0 | 0.001 |
| 813.0 | 0.001 |
| 812.0 | 0.002 |
| 811.0 | 0.001 |
| 810.0 | 0.002 |
| 809.0 | 0.002 |
| 808.0 | 0.002 |
| 807.0 | 0.002 |
| 806.0 | 0.002 |
| 805.0 | 0.002 |
| 804.0 | 0.002 |
| 803.0 | 0.002 |
| 802.0 | 0.002 |
| 801.0 | 0.002 |
| 800.0 | 0.002 |
| 799.0 | 0 |
| 798.0 | 0 |
| 797.0 | 0 |
| 796.0 | 0 |
| 795.0 | 0 |
| 794.0 | 0 |
| 793.0 | 0 |
| 792.0 | 0 |
| 791.0 | 0 |
| 790.0 | 0 |
| 789.0 | 0 |
| 788.0 | 0 |
| 787.0 | 0 |
| 786.0 | 0 |
| 785.0 | 0 |
| 784.0 | 0 |
| 783.0 | 0 |
| 782.0 | 0 |
| 781.0 | 0 |
| 780.0 | 0 |
| 779.0 | 0 |
| 778.0 | 0 |
| 777.0 | 0 |
| 776.0 | 0 |
| 775.0 | 0 |
| 774.0 | 0 |
| 773.0 | 0 |
| 772.0 | 0 |
| 771.0 | 0 |
| 770.0 | 0 |
| 769.0 | 0 |
| 768.0 | 0 |
| 767.0 | 0 |
| 766.0 | 0 |
| 765.0 | 0 |
| 764.0 | 0 |
| 763.0 | 0 |
| 762.0 | 0 |
| 761.0 | 0 |
| 760.0 | 0 |
| 759.0 | 0 |
| 758.0 | 0 |
| 757.0 | 0 |
| 756.0 | 0 |
| 755.0 | 0 |
| 754.0 | 0 |
| 753.0 | 0 |
| 752.0 | 0 |
| 751.0 | 0 |
| 750.0 | 0 |
| 749.0 | 0 |
| 748.0 | 0 |
| 747.0 | 0 |
| 746.0 | 0 |
| 745.0 | 0 |
| 744.0 | 0 |
| 743.0 | 0 |
| 742.0 | 0 |
| 741.0 | 0 |
| 740.0 | 0 |
| 739.0 | 0 |
| 738.0 | 0 |
| 737.0 | 0 |
| 736.0 | 0 |
| 735.0 | 0 |
| 734.0 | 0 |
| 733.0 | 0 |
| 732.0 | 0 |
| 731.0 | 0 |
| 730.0 | 0 |
| 729.0 | 0 |
| 728.0 | 0 |
| 727.0 | 0 |
| 726.0 | 0 |
| 725.0 | 0 |
| 724.0 | 0 |
| 723.0 | 0 |
| 722.0 | 0 |
| 721.0 | 0 |
| 720.0 | 0 |
| 719.0 | 0 |
| 718.0 | 0 |
| 717.0 | 0 |
| 716.0 | 0 |
| 715.0 | 0 |
| 714.0 | 0 |
| 713.0 | 0 |
| 712.0 | 0 |
| 711.0 | 0 |
| 710.0 | 0 |
| 709.0 | 0 |
| 708.0 | 0 |
| 707.0 | 0 |
| 706.0 | 0 |
| 705.0 | 0 |
| 704.0 | 0 |
| 703.0 | 0 |
| 702.0 | 0 |
| 701.0 | 0 |
| 700.0 | 0 |
| 699.0 | 0 |
| 698.0 | 0 |
| 697.0 | 0 |
| 696.0 | 0 |
| 695.0 | 0 |
| 694.0 | 0 |
| 693.0 | 0 |
| 692.0 | 0 |
| 691.0 | 0 |
| 690.0 | 0 |
| 689.0 | 0 |
| 688.0 | 0 |
| 687.0 | 0 |
| 686.0 | 0 |
| 685.0 | 0 |
| 684.0 | 0 |
| 683.0 | 0 |
| 682.0 | 0 |
| 681.0 | 0 |
| 680.0 | 0 |
| 679.0 | 0 |
| 678.0 | 0 |
| 677.0 | 0 |
| 676.0 | 0 |
| 675.0 | 0 |
| 674.0 | 0 |
| 673.0 | 0 |
| 672.0 | 0 |
| 671.0 | 0 |
| 670.0 | 0 |
| 669.0 | 0 |
| 668.0 | 0 |
| 667.0 | 0 |
| 666.0 | 0 |
| 665.0 | 0 |
| 664.0 | 0 |
| 663.0 | 0 |
| 662.0 | 0 |
| 661.0 | 0 |
| 660.0 | 0 |
| 659.0 | 0 |
| 658.0 | 0 |
| 657.0 | 0 |
| 656.0 | 0 |
| 655.0 | 0 |
| 654.0 | 0 |
| 653.0 | 0 |
| 652.0 | 0 |
| 651.0 | 0 |
| 650.0 | 0 |
| 649.0 | 0 |
| 648.0 | 0 |
| 647.0 | 0 |
| 646.0 | 0 |
| 645.0 | 0 |
| 644.0 | 0 |
| 643.0 | 0 |
| 642.0 | 0 |
| 641.0 | 0 |
| 640.0 | 0 |
| 639.0 | 0 |
| 638.0 | 0 |
| 637.0 | 0 |
| 636.0 | 0 |
| 635.0 | 0 |
| 634.0 | 0 |
| 633.0 | 0 |
| 632.0 | 0 |
| 631.0 | 0 |
| 630.0 | 0 |
| 629.0 | 0 |
| 628.0 | 0 |
| 627.0 | 0 |
| 626.0 | 0 |
| 625.0 | 0 |
| 624.0 | 0 |
| 623.0 | 0 |
| 622.0 | 0 |
| 621.0 | 0 |
| 620.0 | 0 |
| 619.0 | 0 |
| 618.0 | 0 |
| 617.0 | 0 |
| 616.0 | 0 |
| 615.0 | 0 |
| 614.0 | 0 |
| 613.0 | 0 |
| 612.0 | 0 |
| 611.0 | 0 |
| 610.0 | 0 |
| 609.0 | 0 |
| 608.0 | 0 |
| 607.0 | 0 |
| 606.0 | 0 |
| 605.0 | 0 |
| 604.0 | 0 |
| 603.0 | 0 |
| 602.0 | 0 |
| 601.0 | 0 |
| 600.0 | 0 |
| 599.0 | 0 |
| 598.0 | 0 |
| 597.0 | 0 |
| 596.0 | 0 |
| 595.0 | 0 |
| 594.0 | 0 |
| 593.0 | 0 |
| 592.0 | 0 |
| 591.0 | 0 |
| 590.0 | 0 |
| 589.0 | 0 |
| 588.0 | 0 |
| 587.0 | 0 |
| 586.0 | 0 |
| 585.0 | 0 |
| 584.0 | 0 |
| 583.0 | 0 |
| 582.0 | 0 |
| 581.0 | 0 |
| 580.0 | 0 |
| 579.0 | 0 |
| 578.0 | 0 |
| 577.0 | 0 |
| 576.0 | 0 |
| 575.0 | 0 |
| 574.0 | 0 |
| 573.0 | 0 |
| 572.0 | 0 |
| 571.0 | 0 |
| 570.0 | 0 |
| 569.0 | 0 |
| 568.0 | 0 |
| 567.0 | 0 |
| 566.0 | 0 |
| 565.0 | 0 |
| 564.0 | 0 |
| 563.0 | 0 |
| 562.0 | 0 |
| 561.0 | 0 |
| 560.0 | 0 |
| 559.0 | 0 |
| 558.0 | 0 |
| 557.0 | 0 |
| 556.0 | 0 |
| 555.0 | 0 |
| 554.0 | 0 |
| 553.0 | 0 |
| 552.0 | 0 |
| 551.0 | 0 |
| 550.0 | 0 |
| 549.0 | 0 |
| 548.0 | 0 |
| 547.0 | 0 |
| 546.0 | 0 |
| 545.0 | 0 |
| 544.0 | 0 |
| 543.0 | 0 |
| 542.0 | 0 |
| 541.0 | 0 |
| 540.0 | 0 |
| 539.0 | 0 |
| 538.0 | 0 |
| 537.0 | 0 |
| 536.0 | 0 |
| 535.0 | 0 |
| 534.0 | 0 |
| 533.0 | 0 |
| 532.0 | 0 |
| 531.0 | 0 |
| 530.0 | 0 |
| 529.0 | 0 |
| 528.0 | 0 |
| 527.0 | 0 |
| 526.0 | 0 |
| 525.0 | 0 |
| 524.0 | 0 |
| 523.0 | 0 |
| 522.0 | 0 |
| 521.0 | 0 |
| 520.0 | 0 |
| 519.0 | 0 |
| 518.0 | 0 |
| 517.0 | 0 |
| 516.0 | 0 |
| 515.0 | 0 |
| 514.0 | 0 |
| 513.0 | 0 |
| 512.0 | 0.001 |
| 511.0 | 0.001 |
| 510.0 | 0.001 |
| 509.0 | 0.001 |
| 508.0 | 0.001 |
| 507.0 | 0.002 |
| 506.0 | 0.002 |
| 505.0 | 0.002 |
| 504.0 | 0.002 |
| 503.0 | 0.002 |
| 502.0 | 0.003 |
| 501.0 | 0.003 |
| 500.0 | 0.003 |
| 499.0 | 0.003 |
| 498.0 | 0.003 |
| 497.0 | 0.003 |
| 496.0 | 0.003 |
| 495.0 | 0.004 |
| 494.0 | 0.004 |
| 493.0 | 0.004 |
| 492.0 | 0.004 |
| 491.0 | 0.005 |
| 490.0 | 0.005 |
| 489.0 | 0.006 |
| 488.0 | 0.006 |
| 487.0 | 0.007 |
| 486.0 | 0.008 |
| 485.0 | 0.009 |
| 484.0 | 0.011 |
| 483.0 | 0.013 |
| 482.0 | 0.016 |
| 481.0 | 0.019 |
| 480.0 | 0.023 |
| 479.0 | 0.029 |
| 478.0 | 0.038 |
| 477.0 | 0.05 |
| 476.0 | 0.067 |
| 475.0 | 0.092 |
| 474.0 | 0.131 |
| 473.0 | 0.192 |
| 472.0 | 0.29 |
| 471.0 | 0.457 |
| 470.0 | 0.755 |
| 469.0 | 1.299 |
| 468.0 | 2.364 |
| 467.0 | 4.503 |
| 466.0 | 8.108 |
| 465.0 | 15.726 |
| 464.0 | 25.478 |
| 463.0 | 36.352 |
| 462.0 | 45.929 |
| 461.0 | 52.651 |
| 460.0 | 56.081 |
| 459.0 | 56.273 |
| 458.0 | 53.713 |
| 457.0 | 49.106 |
| 456.0 | 42.94 |
| 455.0 | 34.648 |
| 454.0 | 24.699 |
| 453.0 | 15.217 |
| 452.0 | 8.243 |
| 451.0 | 4.155 |
| 450.0 | 2.07 |
| 449.0 | 1.07 |
| 448.0 | 0.586 |
| 447.0 | 0.337 |
| 446.0 | 0.203 |
| 445.0 | 0.128 |
| 444.0 | 0.084 |
| 443.0 | 0.057 |
| 442.0 | 0.04 |
| 441.0 | 0.029 |
| 440.0 | 0.021 |
| 439.0 | 0.016 |
| 438.0 | 0.012 |
| 437.0 | 0.01 |
| 436.0 | 0.008 |
| 435.0 | 0.006 |
| 434.0 | 0.005 |
| 433.0 | 0.004 |
| 432.0 | 0.004 |
| 431.0 | 0.003 |
| 430.0 | 0.003 |
| 429.0 | 0.002 |
| 428.0 | 0.002 |
| 427.0 | 0.002 |
| 426.0 | 0.001 |
| 425.0 | 0.001 |
| 424.0 | 0.001 |
| 423.0 | 0.001 |
| 422.0 | 0.001 |
| 421.0 | 0.001 |
| 420.0 | 0 |
| 419.0 | 0 |
| 418.0 | 0 |
| 417.0 | 0 |
| 416.0 | 0 |
| 415.0 | 0 |
| 414.0 | 0 |
| 413.0 | 0 |
| 412.0 | 0 |
| 411.0 | 0 |
| 410.0 | 0 |
| 409.0 | 0 |
| 408.0 | 0 |
| 407.0 | 0 |
| 406.0 | 0 |
| 405.0 | 0 |
| 404.0 | 0 |
| 403.0 | 0 |
| 402.0 | 0 |
| 401.0 | 0 |
| 400.0 | 0 |
| 399.0 | 0 |
| 398.0 | 0 |
| 397.0 | 0 |
| 396.0 | 0 |
| 395.0 | 0 |
| 394.0 | 0 |
| 393.0 | 0 |
| 392.0 | 0 |
| 391.0 | 0 |
| 390.0 | 0 |
| 389.0 | 0 |
| 388.0 | 0.001 |
| 387.0 | 0 |
| 386.0 | 0 |
| 385.0 | 0 |
| 384.0 | 0 |
| 383.0 | 0 |
| 382.0 | 0 |
| 381.0 | 0 |
| 380.0 | 0 |
| 379.0 | 0 |
| 378.0 | 0 |
| 377.0 | 0 |
| 376.0 | 0 |
| 375.0 | 0 |
| 374.0 | 0 |
| 373.0 | 0 |
| 372.0 | 0 |
| 371.0 | 0 |
| 370.0 | 0 |
| 369.0 | 0 |
| 368.0 | 0.001 |
| 367.0 | 0.001 |
| 366.0 | 0.001 |
| 365.0 | 0.001 |
| 364.0 | 0.001 |
| 363.0 | 0.001 |
| 362.0 | 0.001 |
| 361.0 | 0.001 |
| 360.0 | 0.001 |
| 359.0 | 0.001 |
| 358.0 | 0.001 |
| 357.0 | 0.001 |
| 356.0 | 0.001 |
| 355.0 | 0.001 |
| 354.0 | 0 |
| 353.0 | 0 |
| 352.0 | 0 |
| 351.0 | 0 |
| 350.0 | 0 |
| 349.0 | 0 |
| 348.0 | 0 |
| 347.0 | 0 |
| 346.0 | 0 |
| 345.0 | 0 |
| 344.0 | 0 |
| 343.0 | 0 |
| 342.0 | 0 |
| 341.0 | 0 |
| 340.0 | 0 |
| 339.0 | 0 |
| 338.0 | 0 |
| 337.0 | 0 |
| 336.0 | 0 |
| 335.0 | 0 |
| 334.0 | 0 |
| 333.0 | 0 |
| 332.0 | 0 |
| 331.0 | 0 |
| 330.0 | 0 |
| 329.0 | 0 |
| 328.0 | 0 |
| 327.0 | 0 |
| 326.0 | 0 |
| 325.0 | 0 |
| 324.0 | 0 |
| 323.0 | 0 |
| 322.0 | 0 |
| 321.0 | 0 |
| 320.0 | 0 |
| 319.0 | 0 |
| 318.0 | 0 |
| 317.0 | 0 |
| 316.0 | 0 |
| 315.0 | 0 |
| 314.0 | 0 |
| 313.0 | 0 |
| 312.0 | 0 |
| 311.0 | 0 |
| 310.0 | 0 |
| 309.0 | 0 |
| 308.0 | 0 |
| 307.0 | 0 |
| 306.0 | 0 |
| 305.0 | 0 |
| 304.0 | 0 |
| 303.0 | 0 |
| 302.0 | 0 |
| 301.0 | 0 |
| 300.0 | 0 |
| 299.0 | 0 |
| 298.0 | 0 |
| 297.0 | 0 |
| 296.0 | 0 |
| 295.0 | 0 |
| 294.0 | 0 |
| 293.0 | 0 |
| 292.0 | 0 |
| 291.0 | 0 |
| 290.0 | 0 |
| 289.0 | 0 |
| 288.0 | 0 |
| 287.0 | 0 |
| 286.0 | 0 |
| 285.0 | 0 |
| 284.0 | 0 |
| 283.0 | 0 |
| 282.0 | 0 |
| 281.0 | 0 |
| 280.0 | 0 |
| 279.0 | 0 |
| 278.0 | 0 |
| 277.0 | 0 |
| 276.0 | 0 |
| 275.0 | 0 |
| 274.0 | 0 |
| 273.0 | 0 |
| 272.0 | 0 |
| 271.0 | 0 |
| 270.0 | 0 |
| 269.0 | 0 |
| 268.0 | 0 |
| 267.0 | 0 |
| 266.0 | 0 |
| 265.0 | 0 |
| 264.0 | 0 |
| 263.0 | 0 |
| 262.0 | 0 |
| 261.0 | 0 |
| 260.0 | 0 |
| 259.0 | 0 |
| 258.0 | 0 |
| 257.0 | 0 |
| 256.0 | 0 |
| 255.0 | 0 |
| 254.0 | 0 |
| 253.0 | 0 |
| 252.0 | 0 |
| 251.0 | 0 |
| 250.0 | 0 |
| 249.0 | 0 |
| 248.0 | 0 |
| 247.0 | 0 |
| 246.0 | 0 |
| 245.0 | 0 |
| 244.0 | 0 |
| 243.0 | 0 |
| 242.0 | 0 |
| 241.0 | 0 |
| 240.0 | 0 |
| 239.0 | 0 |
| 238.0 | 0 |
| 237.0 | 0 |
| 236.0 | 0 |
| 235.0 | 0 |
| 234.0 | 0 |
| 233.0 | 0 |
| 232.0 | 0 |
| 231.0 | 0 |
| 230.0 | 0 |
| 229.0 | 0 |
| 228.0 | 0 |
| 227.0 | 0 |
| 226.0 | 0 |
| 225.0 | 0 |
| 224.0 | 0 |
| 223.0 | 0 |
| 222.0 | 0 |
| 221.0 | 0 |
| 220.0 | 0 |
| 219.0 | 0 |
| 218.0 | 0 |
| 217.0 | 0 |
| 216.0 | 0 |
| 215.0 | 0 |
| 214.0 | 0 |
| 213.0 | 0 |
| 212.0 | 0 |
| 211.0 | 0 |
| 210.0 | 0 |
| 209.0 | 0 |
| 208.0 | 0 |
| 207.0 | 0 |
| 206.0 | 0 |
| 205.0 | 0 |
| 204.0 | 0 |
| 203.0 | 0 |
| 202.0 | 0 |
| 201.0 | 0 |